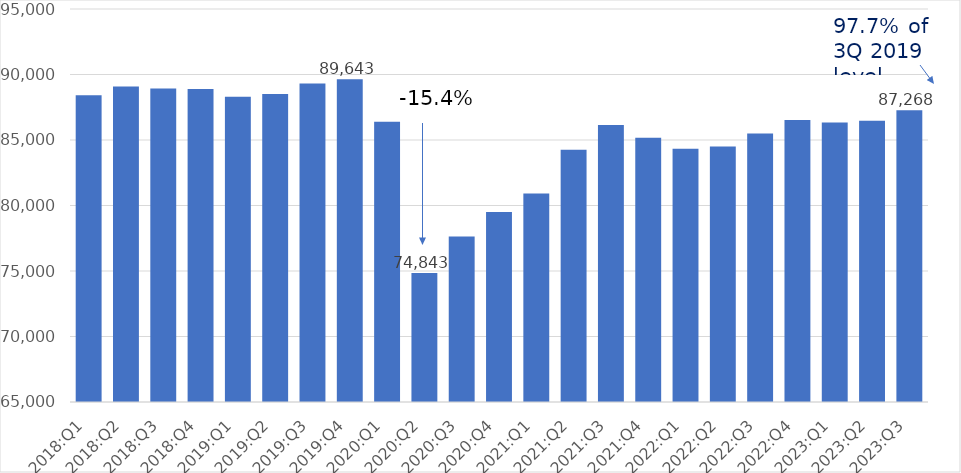
| Category | R. GDP |
|---|---|
| 2018:Q1 | 88417.7 |
| 2018:Q2 | 89084.7 |
| 2018:Q3 | 88940.8 |
| 2018:Q4 | 88902.4 |
| 2019:Q1 | 88310 |
| 2019:Q2 | 88513.5 |
| 2019:Q3 | 89314.9 |
| 2019:Q4 | 89642.6 |
| 2020:Q1 | 86391.4 |
| 2020:Q2 | 74843.1 |
| 2020:Q3 | 77638.9 |
| 2020:Q4 | 79496.8 |
| 2021:Q1 | 80907.7 |
| 2021:Q2 | 84249.8 |
| 2021:Q3 | 86150.9 |
| 2021:Q4 | 85177.7 |
| 2022:Q1 | 84337.5 |
| 2022:Q2 | 84498.9 |
| 2022:Q3 | 85488.2 |
| 2022:Q4 | 86521.1 |
| 2023:Q1 | 86337.2 |
| 2023:Q2 | 86472.3 |
| 2023:Q3 | 87268.3 |